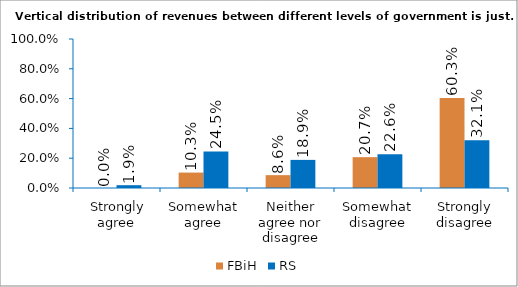
| Category | FBiH | RS |
|---|---|---|
|  Strongly agree | 0 | 0.019 |
| Somewhat agree | 0.103 | 0.245 |
| Neither agree nor disagree | 0.086 | 0.189 |
| Somewhat disagree | 0.207 | 0.226 |
| Strongly disagree | 0.603 | 0.321 |